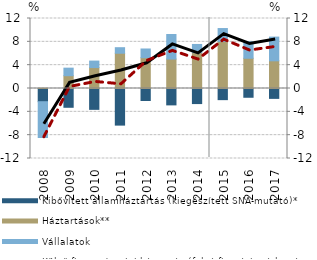
| Category | Kibővített államháztartás (kiegészített SNA-mutató)* | Háztartások** | Vállalatok |
|---|---|---|---|
| 2008.0 | -2.264 | 0.05 | -6.137 |
| 2009.0 | -3.22 | 2.193 | 1.295 |
| 2010.0 | -3.574 | 3.586 | 1.114 |
| 2011.0 | -6.277 | 6.046 | 0.95 |
| 2012.0 | -2.058 | 5.28 | 1.493 |
| 2013.0 | -2.809 | 5.049 | 4.205 |
| 2014.0 | -2.584 | 6.144 | 1.406 |
| 2015.0 | -1.911 | 8.061 | 2.217 |
| 2016.0 | -1.502 | 5.184 | 2.835 |
| 2017.0 | -1.694 | 4.744 | 4.068 |